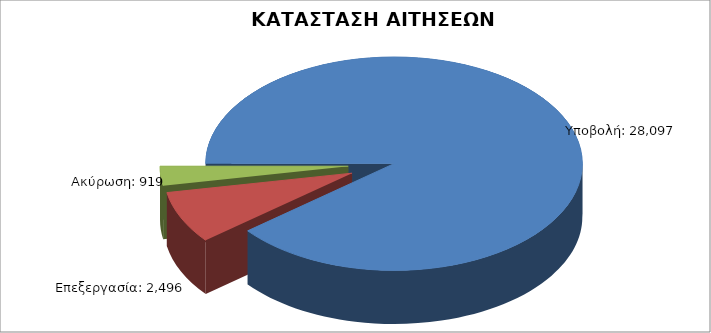
| Category | Series 0 |
|---|---|
| Υποβολή: | 28097 |
| Επεξεργασία: | 2496 |
| Ακύρωση: | 919 |